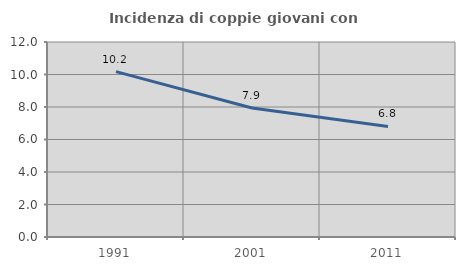
| Category | Incidenza di coppie giovani con figli |
|---|---|
| 1991.0 | 10.176 |
| 2001.0 | 7.939 |
| 2011.0 | 6.801 |